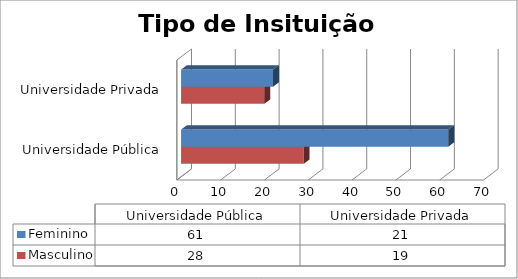
| Category | Masculino | Feminino |
|---|---|---|
| Universidade Pública | 28 | 61 |
| Universidade Privada | 19 | 21 |